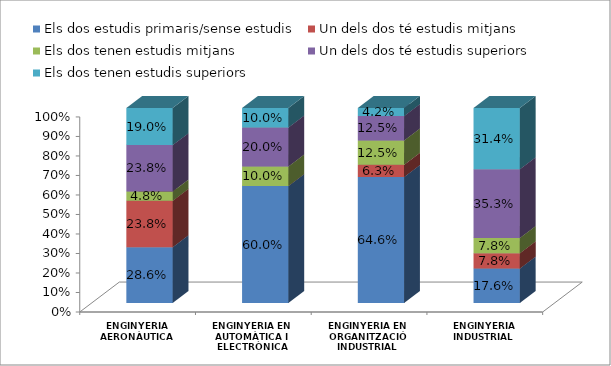
| Category | Els dos estudis primaris/sense estudis | Un dels dos té estudis mitjans | Els dos tenen estudis mitjans | Un dels dos té estudis superiors | Els dos tenen estudis superiors |
|---|---|---|---|---|---|
| ENGINYERIA AERONÀUTICA | 0.286 | 0.238 | 0.048 | 0.238 | 0.19 |
| ENGINYERIA EN AUTOMÀTICA I ELECTRÒNICA INDUSTRIAL | 0.6 | 0 | 0.1 | 0.2 | 0.1 |
| ENGINYERIA EN ORGANITZACIÓ INDUSTRIAL | 0.646 | 0.062 | 0.125 | 0.125 | 0.042 |
| ENGINYERIA INDUSTRIAL | 0.176 | 0.078 | 0.078 | 0.353 | 0.314 |